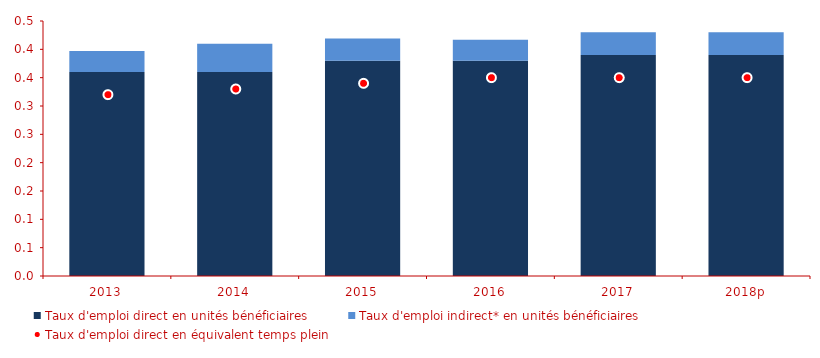
| Category | Taux d'emploi direct en unités bénéficiaires | Taux d'emploi indirect* en unités bénéficiaires |
|---|---|---|
| 2013 | 3.6 | 0.37 |
| 2014 | 3.6 | 0.5 |
| 2015 | 3.8 | 0.39 |
| 2016 | 3.8 | 0.37 |
| 2017 | 3.9 | 0.4 |
| 2018p | 3.9 | 0.4 |